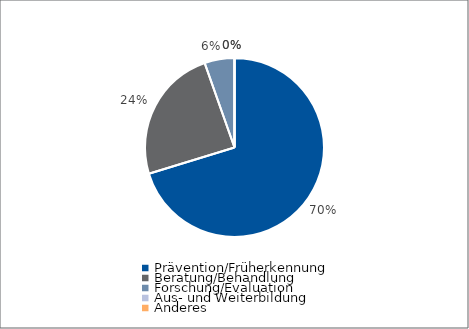
| Category | Series 0 |
|---|---|
| Prävention/Früherkennung | 26000 |
| Beratung/Behandlung | 9000 |
| Forschung/Evaluation | 2000 |
| Aus- und Weiterbildung | 0 |
| Anderes | 0 |